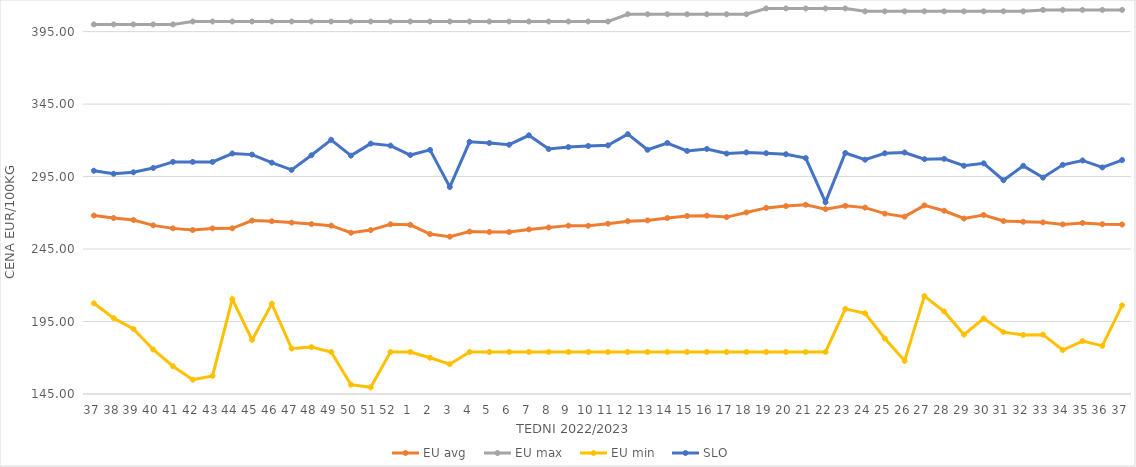
| Category | EU avg | EU max | EU min | SLO |
|---|---|---|---|---|
| 37.0 | 268.136 | 400 | 207.594 | 299.02 |
| 38.0 | 266.39 | 400 | 197.352 | 296.91 |
| 39.0 | 265.059 | 400 | 189.926 | 297.96 |
| 40.0 | 261.35 | 400 | 175.723 | 300.95 |
| 41.0 | 259.271 | 400 | 164.165 | 305.13 |
| 42.0 | 258.146 | 402 | 154.869 | 305.13 |
| 43.0 | 259.256 | 402 | 157.459 | 305.13 |
| 44.0 | 259.32 | 402 | 210.415 | 310.93 |
| 45.0 | 264.649 | 402 | 182.35 | 310.16 |
| 46.0 | 264.228 | 402 | 207.247 | 304.58 |
| 47.0 | 263.24 | 402 | 176.378 | 299.59 |
| 48.0 | 262.225 | 402 | 177.332 | 309.69 |
| 49.0 | 261.152 | 402 | 174 | 320.38 |
| 50.0 | 256.24 | 402 | 151.434 | 309.44 |
| 51.0 | 258.071 | 402 | 149.638 | 317.74 |
| 52.0 | 262.088 | 402 | 174 | 316.36 |
| 1.0 | 261.716 | 402 | 174 | 309.84 |
| 2.0 | 255.331 | 402 | 169.983 | 313.4 |
| 3.0 | 253.546 | 402 | 165.574 | 287.81 |
| 4.0 | 257.051 | 402 | 174 | 318.98 |
| 5.0 | 256.808 | 402 | 174 | 318.13 |
| 6.0 | 256.75 | 402 | 174 | 316.99 |
| 7.0 | 258.565 | 402 | 174 | 323.47 |
| 8.0 | 259.872 | 402 | 174 | 314 |
| 9.0 | 261.164 | 402 | 174 | 315.35 |
| 10.0 | 261.06 | 402 | 174 | 316.13 |
| 11.0 | 262.513 | 402 | 174 | 316.55 |
| 12.0 | 264.228 | 407 | 174 | 324.27 |
| 13.0 | 264.768 | 407 | 174 | 313.49 |
| 14.0 | 266.385 | 407 | 174 | 318.17 |
| 15.0 | 267.797 | 407 | 174 | 312.7 |
| 16.0 | 268.021 | 407 | 174 | 314.07 |
| 17.0 | 267.041 | 407 | 174 | 310.87 |
| 18.0 | 270.255 | 407 | 174 | 311.69 |
| 19.0 | 273.406 | 411 | 174 | 311.13 |
| 20.0 | 274.631 | 411 | 174 | 310.42 |
| 21.0 | 275.561 | 411 | 174 | 307.76 |
| 22.0 | 272.542 | 411 | 174 | 277.34 |
| 23.0 | 274.85 | 411 | 203.728 | 311.28 |
| 24.0 | 273.59 | 409 | 200.686 | 306.64 |
| 25.0 | 269.439 | 409 | 183.275 | 311.1 |
| 26.0 | 267.345 | 409 | 167.858 | 311.62 |
| 27.0 | 275.123 | 409 | 212.506 | 307.04 |
| 28.0 | 271.42 | 409 | 201.945 | 307.23 |
| 29.0 | 266.08 | 409 | 186.018 | 302.45 |
| 30.0 | 268.49 | 409 | 197.093 | 304.14 |
| 31.0 | 264.334 | 409 | 187.684 | 292.49 |
| 32.0 | 263.844 | 409 | 185.774 | 302.41 |
| 33.0 | 263.441 | 410 | 185.951 | 294.3 |
| 34.0 | 262.028 | 410 | 175.332 | 303.1 |
| 35.0 | 262.997 | 410 | 181.543 | 306.13 |
| 36.0 | 262.139 | 410 | 178.207 | 301.32 |
| 37.0 | 261.948 | 410 | 206.146 | 306.4 |